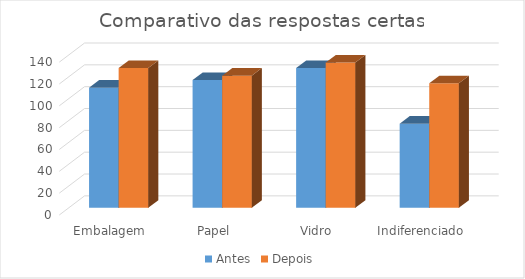
| Category | Antes | Depois |
|---|---|---|
| Embalagem | 110 | 128 |
| Papel | 117 | 121 |
| Vidro | 128 | 133 |
| Indiferenciado | 77 | 114 |